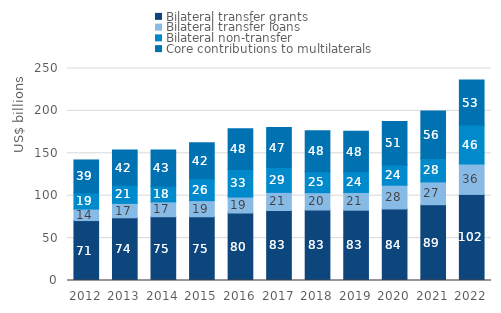
| Category | Bilateral transfer grants | Bilateral transfer loans | Bilateral non-transfer | Core contributions to multilaterals |
|---|---|---|---|---|
| 2012.0 | 70699.147 | 13550.493 | 19040.653 | 38858.699 |
| 2013.0 | 73940.013 | 17014.171 | 21414.07 | 41628.212 |
| 2014.0 | 75205.423 | 17486.49 | 18407.13 | 42925.127 |
| 2015.0 | 75146.551 | 19059.225 | 25668.897 | 42429.924 |
| 2016.0 | 79585.172 | 18790.986 | 32547.885 | 48128.581 |
| 2017.0 | 82560.261 | 21340.92 | 29296.27 | 47081.878 |
| 2018.0 | 83113.518 | 20466.765 | 24604.256 | 48450.971 |
| 2019.0 | 82924.014 | 20883.769 | 24424.373 | 47645.212 |
| 2020.0 | 84356.608 | 27973.379 | 24017.669 | 51204.35 |
| 2021.0 | 89365.756 | 26858.086 | 27765.451 | 55881.538 |
| 2022.0 | 101523.726 | 35738.322 | 46040.003 | 53029.979 |